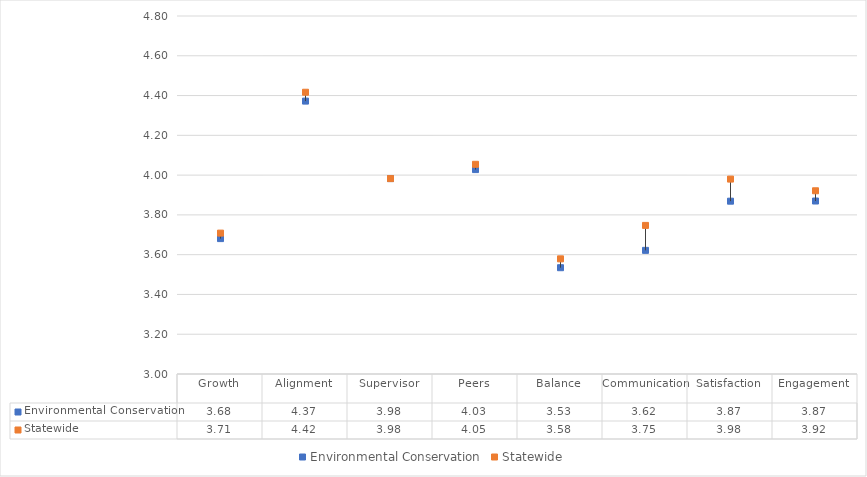
| Category | Environmental Conservation | Statewide |
|---|---|---|
| Growth | 3.681 | 3.708 |
| Alignment | 4.372 | 4.417 |
| Supervisor | 3.983 | 3.983 |
| Peers | 4.028 | 4.054 |
| Balance | 3.534 | 3.579 |
| Communication | 3.622 | 3.747 |
| Satisfaction | 3.869 | 3.98 |
| Engagement | 3.87 | 3.921 |